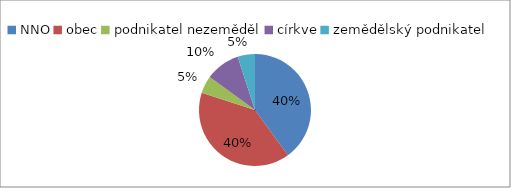
| Category | výzva 2/2010 |
|---|---|
| NNO | 8 |
| obec | 8 |
| podnikatel nezeměděl | 1 |
| církve | 2 |
| zemědělský podnikatel | 1 |